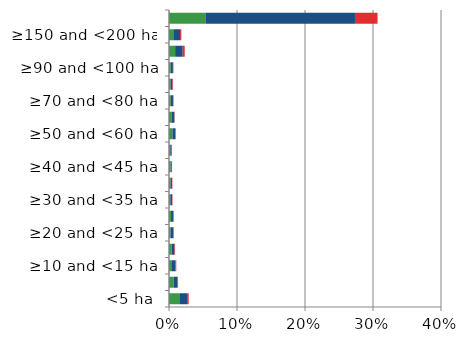
| Category | England | Scotland | Wales |
|---|---|---|---|
| <5 ha | 0.016 | 0.01 | 0.002 |
| ≥5 and <10 ha | 0.007 | 0.006 | 0.001 |
| ≥10 and <15 ha | 0.004 | 0.005 | 0.001 |
| ≥15 and <20 ha | 0.004 | 0.004 | 0.001 |
| ≥20 and <25 ha | 0.002 | 0.004 | 0.001 |
| ≥25 and <30 ha | 0.003 | 0.003 | 0.001 |
| ≥30 and <35 ha | 0.002 | 0.003 | 0.001 |
| ≥35 and <40 ha | 0.002 | 0.002 | 0.001 |
| ≥40 and <45 ha | 0.002 | 0.002 | 0 |
| ≥45 and <50 ha | 0.002 | 0.002 | 0 |
| ≥50 and <60 ha | 0.005 | 0.004 | 0.001 |
| ≥60 and <70 ha | 0.004 | 0.004 | 0 |
| ≥70 and <80 ha | 0.003 | 0.003 | 0.001 |
| ≥80 and <90 ha | 0.002 | 0.003 | 0.001 |
| ≥90 and <100 ha | 0.002 | 0.003 | 0.001 |
| ≥100 and <150 ha | 0.009 | 0.011 | 0.003 |
| ≥150 and <200 ha | 0.007 | 0.009 | 0.002 |
| ≥200 ha | 0.054 | 0.22 | 0.033 |